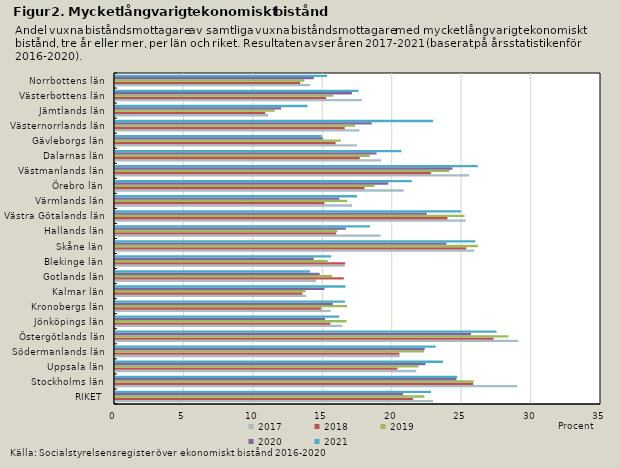
| Category | 2017 | 2018 | 2019 | 2020 | 2021 |
|---|---|---|---|---|---|
| RIKET | 22.9 | 21.465 | 22.274 | 20.745 | 22.755 |
| Stockholms län | 28.969 | 25.798 | 25.835 | 24.59 | 24.654 |
| Uppsala län | 21.698 | 20.34 | 21.858 | 22.362 | 23.612 |
| Södermanlands län | 20.508 | 20.482 | 22.254 | 22.306 | 23.095 |
| Östergötlands län | 29.034 | 27.259 | 28.337 | 25.645 | 27.481 |
| Jönköpings län | 16.361 | 15.514 | 16.671 | 15.123 | 16.152 |
| Kronobergs län | 15.53 | 14.855 | 16.71 | 15.688 | 16.557 |
| Kalmar län | 13.779 | 13.498 | 13.731 | 15.087 | 16.605 |
| Gotlands län | 14.476 | 16.476 | 15.63 | 14.738 | 14.034 |
| Blekinge län | 16.537 | 16.577 | 15.324 | 14.306 | 15.566 |
| Skåne län | 25.863 | 25.3 | 26.13 | 23.872 | 25.953 |
| Hallands län | 19.134 | 15.932 | 16.02 | 16.629 | 18.356 |
| Västra Götalands län | 25.259 | 23.941 | 25.167 | 22.455 | 24.928 |
| Värmlands län | 17.077 | 15.08 | 16.721 | 16.157 | 17.432 |
| Örebro län | 20.782 | 17.973 | 18.685 | 19.679 | 21.373 |
| Västmanlands län | 25.52 | 22.75 | 24.069 | 24.301 | 26.118 |
| Dalarnas län | 19.179 | 17.623 | 18.34 | 18.832 | 20.629 |
| Gävleborgs län | 17.42 | 15.89 | 16.261 | 14.969 | 14.885 |
| Västernorrlands län | 17.612 | 16.545 | 17.285 | 18.49 | 22.911 |
| Jämtlands län | 11.021 | 10.82 | 11.509 | 11.97 | 13.861 |
| Västerbottens län | 17.777 | 15.2 | 15.719 | 17.06 | 17.536 |
| Norrbottens län | 14.062 | 13.346 | 13.634 | 14.319 | 15.269 |